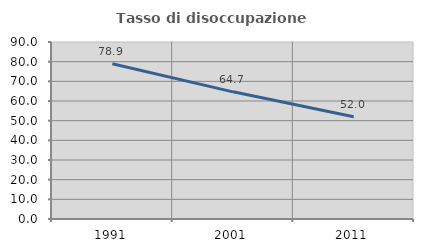
| Category | Tasso di disoccupazione giovanile  |
|---|---|
| 1991.0 | 78.922 |
| 2001.0 | 64.657 |
| 2011.0 | 51.98 |